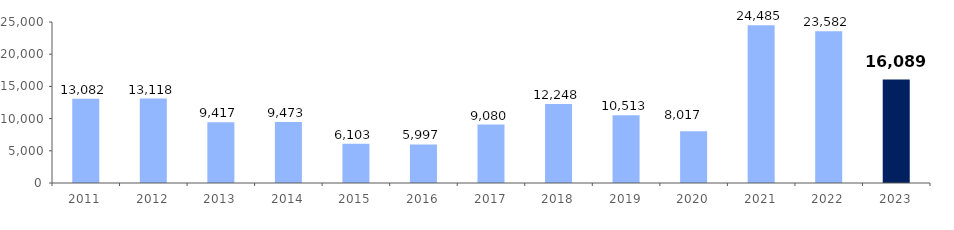
| Category | Series 0 |
|---|---|
| 2011.0 | 13082.401 |
| 2012.0 | 13118.451 |
| 2013.0 | 9417.192 |
| 2014.0 | 9472.688 |
| 2015.0 | 6103.296 |
| 2016.0 | 5997.204 |
| 2017.0 | 9080.09 |
| 2018.0 | 12248.277 |
| 2019.0 | 10513.433 |
| 2020.0 | 8016.914 |
| 2021.0 | 24484.572 |
| 2022.0 | 23582.127 |
| 2023.0 | 16089.35 |